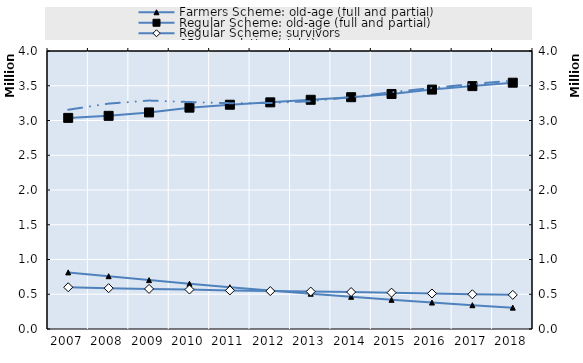
| Category | Farmers Scheme: old-age (full and partial) | Regular Scheme: old-age (full and partial) | Regular Scheme: survivors |
|---|---|---|---|
| 2007.0 | 814609 | 3037618.75 | 600806.5 |
| 2008.0 | 759563.5 | 3067085.75 | 587473.5 |
| 2009.0 | 703438 | 3116186 | 577098 |
| 2010.0 | 651002.167 | 3184823.167 | 567978.417 |
| 2011.0 | 600730 | 3226873 | 554878 |
| 2012.0 | 552613.417 | 3261179.583 | 545453.75 |
| 2013.0 | 507448 | 3298050 | 538836 |
| 2014.0 | 463502 | 3335249 | 531504 |
| 2015.0 | 420153 | 3381560 | 522998 |
| 2016.0 | 380621 | 3444547 | 510894 |
| 2017.0 | 342204 | 3494764 | 499904 |
| 2018.0 | 307389 | 3543885 | 491078 |